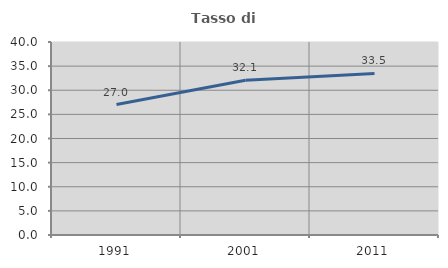
| Category | Tasso di occupazione   |
|---|---|
| 1991.0 | 27.03 |
| 2001.0 | 32.088 |
| 2011.0 | 33.495 |